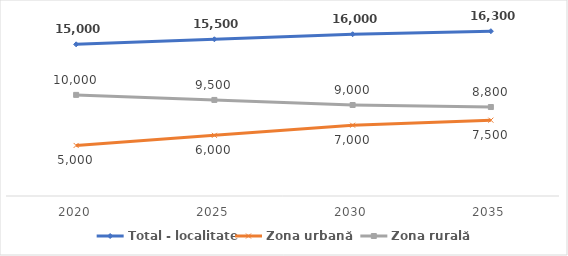
| Category | Total - localitate | Zona urbană   | Zona rurală  |
|---|---|---|---|
| 2020 | 15000 | 5000 | 10000 |
| 2025 | 15500 | 6000 | 9500 |
| 2030 | 16000 | 7000 | 9000 |
| 2035 | 16300 | 7500 | 8800 |